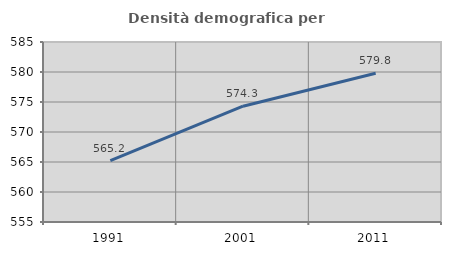
| Category | Densità demografica |
|---|---|
| 1991.0 | 565.231 |
| 2001.0 | 574.304 |
| 2011.0 | 579.783 |